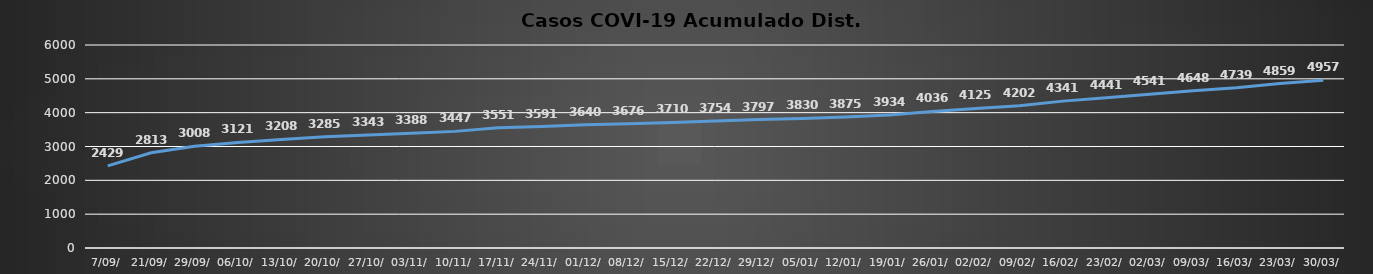
| Category | Majes |
|---|---|
| 7/09/ | 2429 |
| 21/09/ | 2813 |
| 29/09/ | 3008 |
| 06/10/ | 3121 |
| 13/10/ | 3208 |
| 20/10/ | 3285 |
| 27/10/ | 3343 |
| 03/11/ | 3388 |
| 10/11/ | 3447 |
| 17/11/ | 3551 |
| 24/11/ | 3591 |
| 01/12/ | 3640 |
| 08/12/ | 3676 |
| 15/12/ | 3710 |
| 22/12/ | 3754 |
| 29/12/ | 3797 |
| 05/01/ | 3830 |
| 12/01/ | 3875 |
| 19/01/ | 3934 |
| 26/01/ | 4036 |
| 02/02/ | 4125 |
| 09/02/ | 4202 |
| 16/02/ | 4341 |
| 23/02/ | 4441 |
| 02/03/ | 4541 |
| 09/03/ | 4648 |
| 16/03/ | 4739 |
| 23/03/ | 4859 |
| 30/03/ | 4957 |